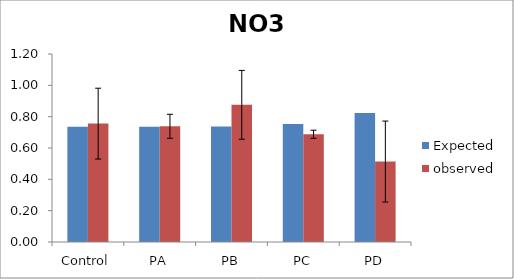
| Category | Expected | observed |
|---|---|---|
| Control | 0.736 | 0.756 |
| PA | 0.736 | 0.739 |
| PB | 0.738 | 0.876 |
| PC | 0.754 | 0.688 |
| PD | 0.824 | 0.514 |